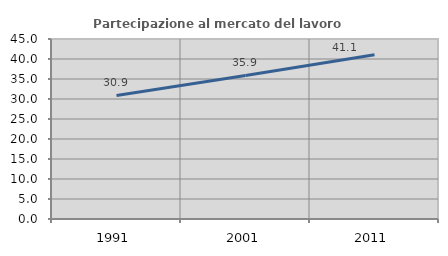
| Category | Partecipazione al mercato del lavoro  femminile |
|---|---|
| 1991.0 | 30.894 |
| 2001.0 | 35.899 |
| 2011.0 | 41.055 |